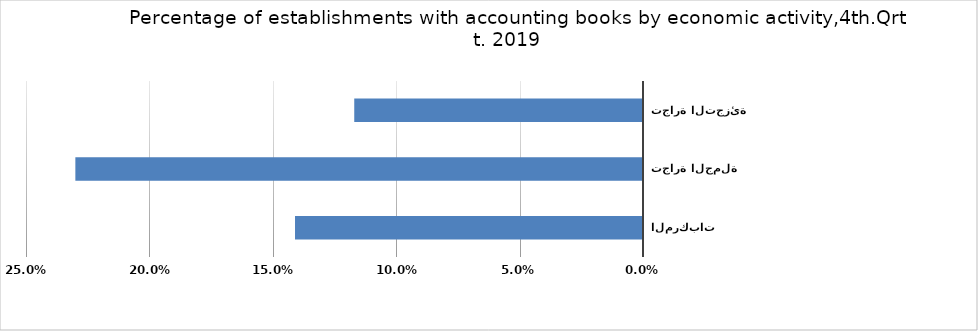
| Category | Accounting books |
|---|---|
| بيع وإصلاح المركبات  | 0.141 |
| تجارة الجملة | 0.23 |
| تجارة التجزئة | 0.117 |